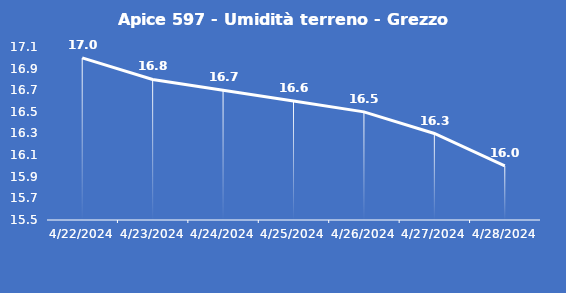
| Category | Apice 597 - Umidità terreno - Grezzo (%VWC) |
|---|---|
| 4/22/24 | 17 |
| 4/23/24 | 16.8 |
| 4/24/24 | 16.7 |
| 4/25/24 | 16.6 |
| 4/26/24 | 16.5 |
| 4/27/24 | 16.3 |
| 4/28/24 | 16 |